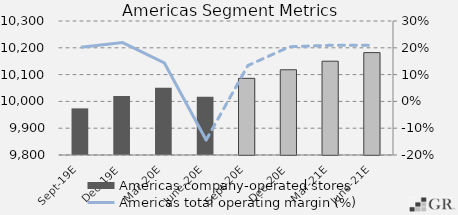
| Category | Americas company-operated stores |
|---|---|
|  Sept-19E  | 9974 |
|  Dec-19E  | 10020 |
|  Mar-20E  | 10051 |
|  June-20E  | 10017 |
|  Sept-20E  | 10086 |
|  Dec-20E  | 10118 |
|  Mar-21E  | 10150 |
|  June-21E  | 10182 |